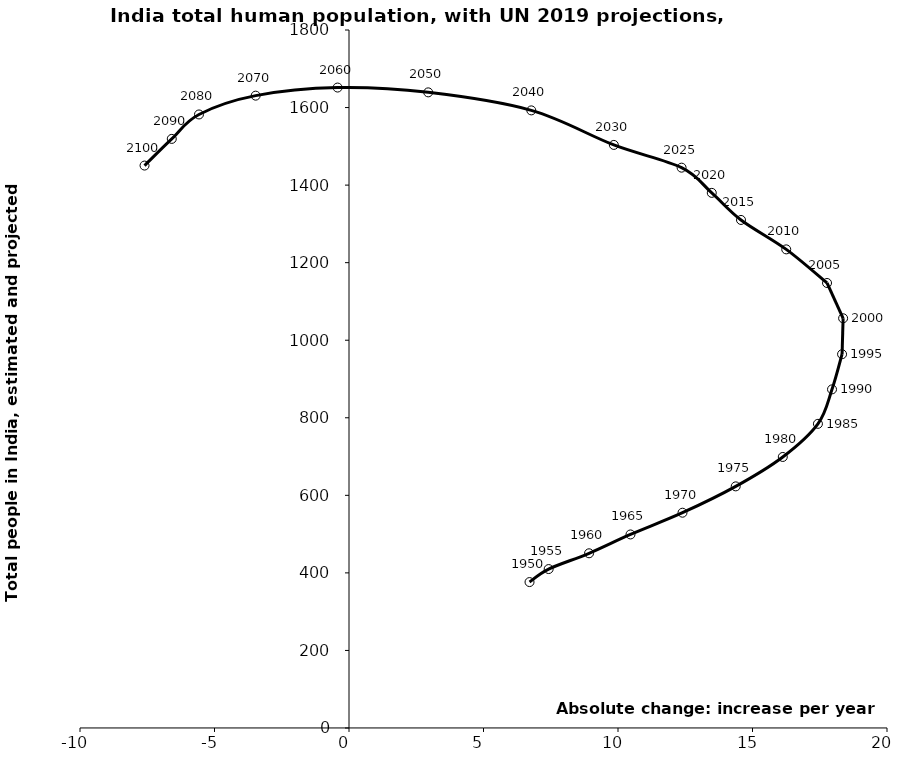
| Category | Series 0 |
|---|---|
| 6.711079000000018 | 376.325 |
| 7.4222479000000305 | 409.881 |
| 8.924272900000005 | 450.548 |
| 10.464211299999983 | 499.123 |
| 12.39795729999995 | 555.19 |
| 14.376305199999967 | 623.103 |
| 16.125711100000036 | 698.953 |
| 17.43249540000004 | 784.36 |
| 17.956258000000012 | 873.278 |
| 18.329775100000006 | 963.923 |
| 18.368733899999995 | 1056.576 |
| 17.770562099999914 | 1147.61 |
| 16.254247599999985 | 1234.281 |
| 14.57232150000009 | 1310.152 |
| 13.485921699999995 | 1380.004 |
| 12.363793700000064 | 1445.012 |
| 9.845326200000015 | 1503.642 |
| 6.776685549999923 | 1592.692 |
| 2.9449007500000106 | 1639.176 |
| -0.4235053999999536 | 1651.59 |
| -3.4698136500000034 | 1630.706 |
| -5.576482850000071 | 1582.193 |
| -6.588620800000035 | 1519.176 |
| -7.600758749999999 | 1450.421 |